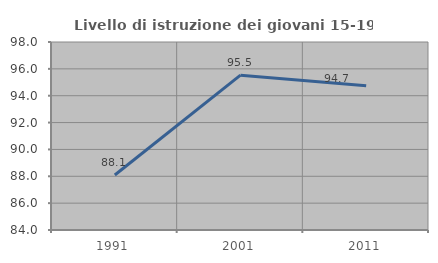
| Category | Livello di istruzione dei giovani 15-19 anni |
|---|---|
| 1991.0 | 88.095 |
| 2001.0 | 95.528 |
| 2011.0 | 94.737 |